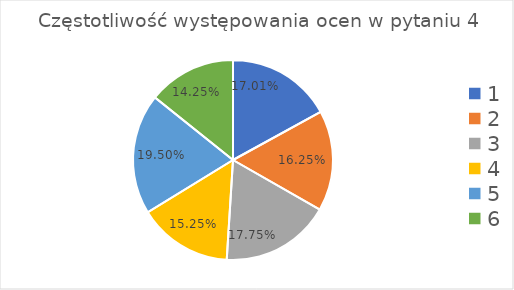
| Category | PYT4 |
|---|---|
| 0 | 68 |
| 1 | 65 |
| 2 | 71 |
| 3 | 61 |
| 4 | 78 |
| 5 | 57 |